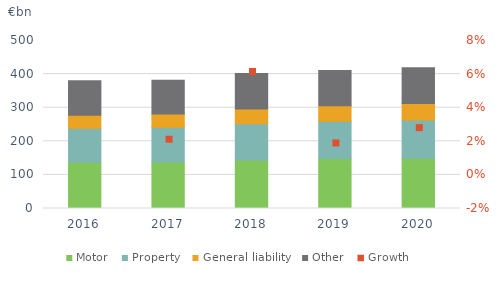
| Category | Motor | Property | General liability | Accident | Other |
|---|---|---|---|---|---|
| 2016.0 | 137.4 | 101.357 | 38.978 |  | 102.346 |
| 2017.0 | 138.635 | 102.984 | 39.983 |  | 100.139 |
| 2018.0 | 144.687 | 107.704 | 43.719 |  | 105.4 |
| 2019.0 | 148.536 | 110.975 | 46.327 |  | 105.109 |
| 2020.0 | 149.392 | 114.046 | 49.202 |  | 106.424 |